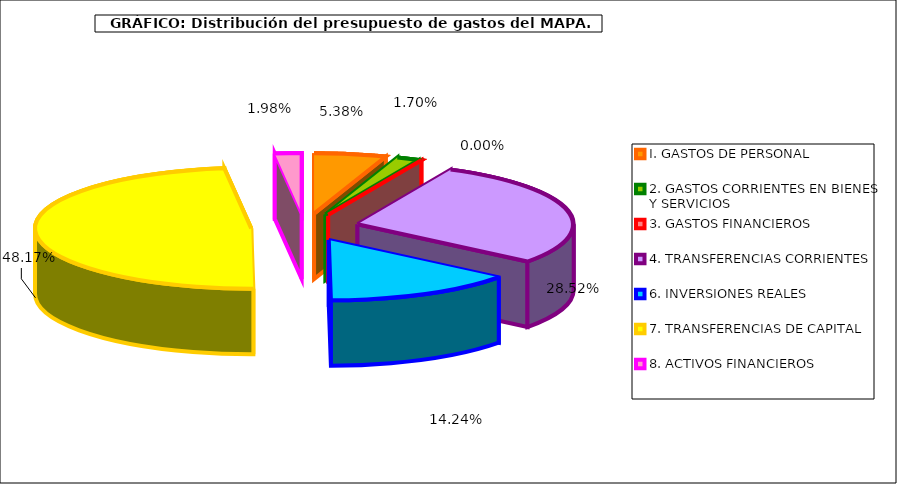
| Category | I. GASTOS DE PERSONAL |
|---|---|
| I. GASTOS DE PERSONAL | 68211560 |
| 2. GASTOS CORRIENTES EN BIENES Y SERVICIOS | 21507430 |
| 3. GASTOS FINANCIEROS | 38350 |
| 4. TRANSFERENCIAS CORRIENTES | 361317030 |
| 6. INVERSIONES REALES | 180378250 |
| 7. TRANSFERENCIAS DE CAPITAL | 610334360 |
| 8. ACTIVOS FINANCIEROS | 25137520 |